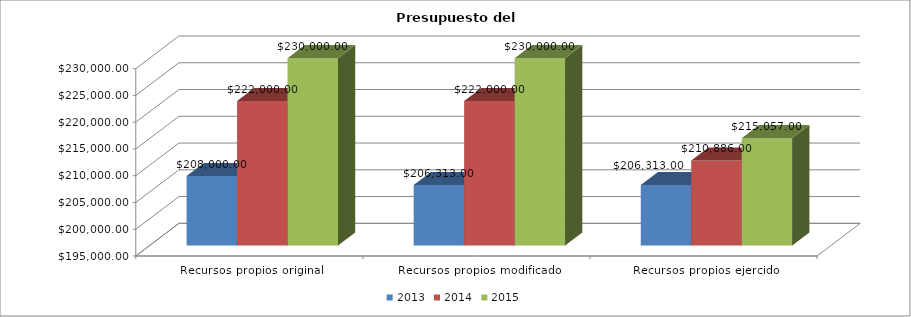
| Category | 2013 | 2014 | 2015 |
|---|---|---|---|
| Recursos propios original | 208000 | 222000 | 230000 |
| Recursos propios modificado | 206313 | 222000 | 230000 |
| Recursos propios ejercido | 206313 | 210886 | 215057 |